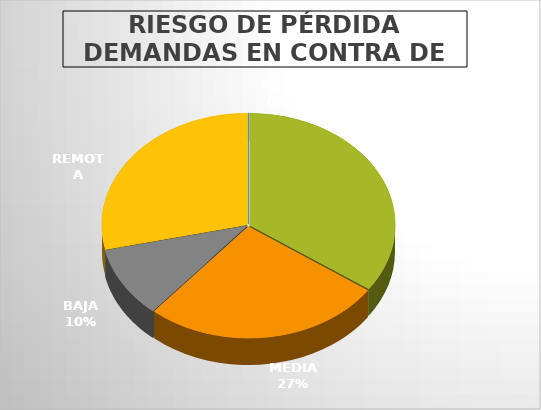
| Category | Series 0 |
|---|---|
| #N/A | 0 |
| ALTA | 17 |
| MEDIA | 13 |
| BAJA | 5 |
| REMOTA | 14 |